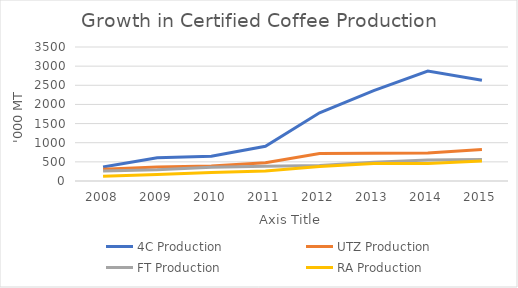
| Category | 4C Production | UTZ Production | FT Production | RA Production |
|---|---|---|---|---|
| 2008.0 | 367 | 308 | 261 | 124 |
| 2009.0 | 607 | 366 | 293 | 168 |
| 2010.0 | 646 | 394 | 358 | 219 |
| 2011.0 | 906 | 477 | 386 | 261 |
| 2012.0 | 1782 | 716 | 402 | 378 |
| 2013.0 | 2360 | 727 | 489 | 455 |
| 2014.0 | 2872 | 730 | 549 | 457 |
| 2015.0 | 2629 | 821 | 561 | 522 |